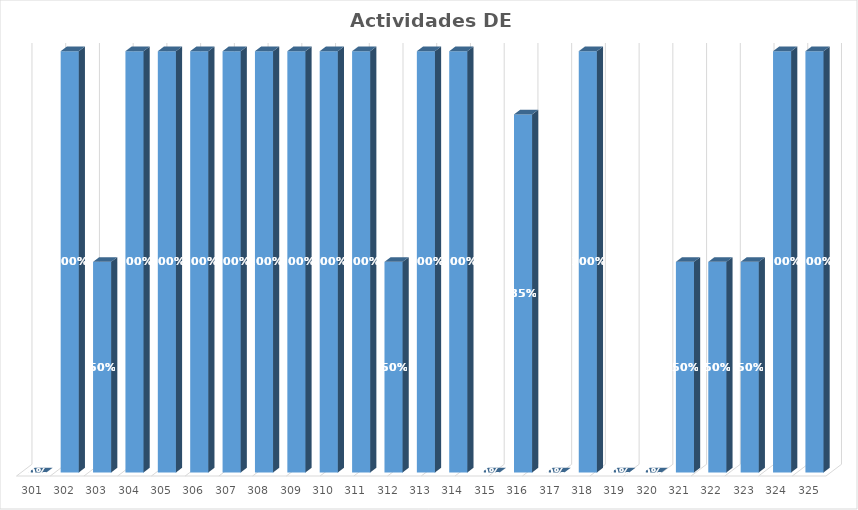
| Category | % Avance |
|---|---|
| 301.0 | 0 |
| 302.0 | 1 |
| 303.0 | 0.5 |
| 304.0 | 1 |
| 305.0 | 1 |
| 306.0 | 1 |
| 307.0 | 1 |
| 308.0 | 1 |
| 309.0 | 1 |
| 310.0 | 1 |
| 311.0 | 1 |
| 312.0 | 0.5 |
| 313.0 | 1 |
| 314.0 | 1 |
| 315.0 | 0 |
| 316.0 | 0.85 |
| 317.0 | 0 |
| 318.0 | 1 |
| 319.0 | 0 |
| 320.0 | 0 |
| 321.0 | 0.5 |
| 322.0 | 0.5 |
| 323.0 | 0.5 |
| 324.0 | 1 |
| 325.0 | 1 |